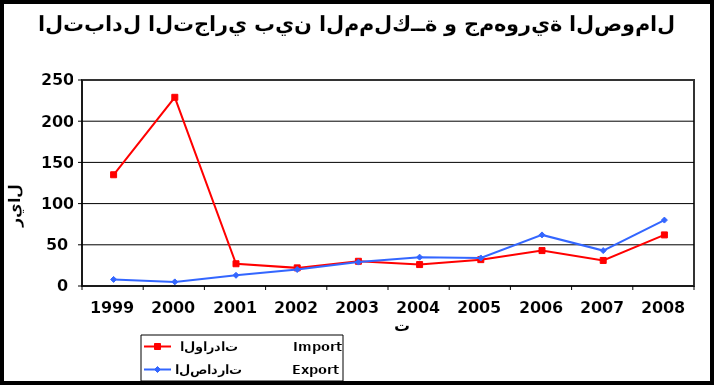
| Category |  الواردات           Import | الصادرات          Export |
|---|---|---|
| 1999.0 | 135 | 8 |
| 2000.0 | 229 | 5 |
| 2001.0 | 27 | 13 |
| 2002.0 | 22 | 20 |
| 2003.0 | 30 | 29 |
| 2004.0 | 26 | 35 |
| 2005.0 | 32 | 34 |
| 2006.0 | 43 | 62 |
| 2007.0 | 31 | 43 |
| 2008.0 | 62 | 80 |